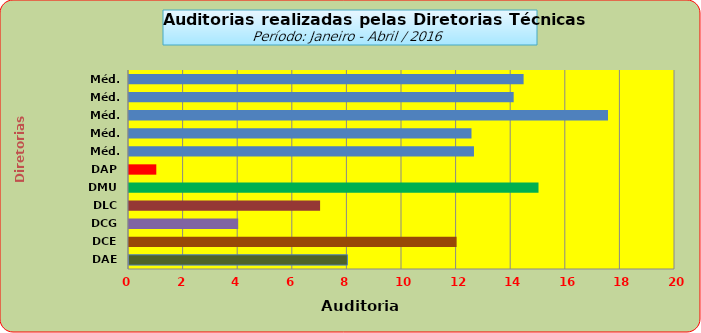
| Category | Series 0 |
|---|---|
| DAE | 8 |
| DCE | 12 |
| DCG | 4 |
| DLC | 7 |
| DMU | 15 |
| DAP | 1 |
| Méd. 2011 | 12.636 |
| Méd. 2012 | 12.545 |
| Méd. 2013 | 17.545 |
| Méd. 2014 | 14.091 |
| Méd. 2014 | 14.455 |